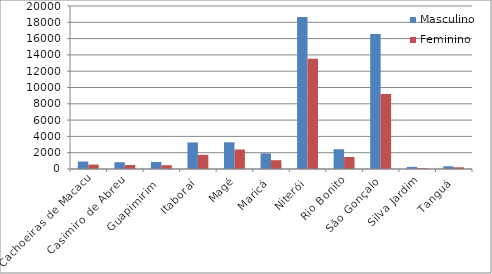
| Category | Masculino | Feminino |
|---|---|---|
| Cachoeiras de Macacu | 920 | 537 |
| Casimiro de Abreu | 831 | 486 |
| Guapimirim  | 866 | 466 |
| Itaboraí | 3262 | 1735 |
| Magé | 3272 | 2392 |
| Maricá | 1919 | 1078 |
| Niterói | 18658 | 13514 |
| Rio Bonito | 2422 | 1474 |
| São Gonçalo | 16576 | 9205 |
| Silva Jardim | 260 | 99 |
| Tanguá | 333 | 207 |